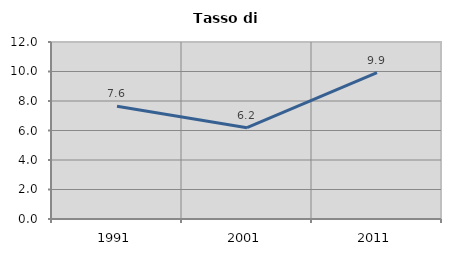
| Category | Tasso di disoccupazione   |
|---|---|
| 1991.0 | 7.648 |
| 2001.0 | 6.193 |
| 2011.0 | 9.93 |